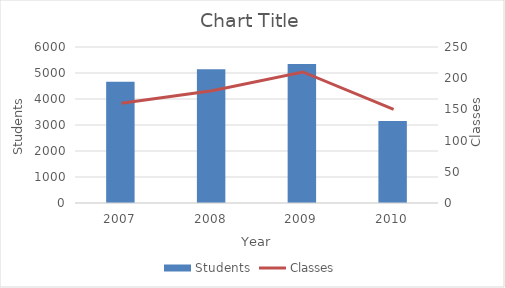
| Category | Students |
|---|---|
| 2007.0 | 4667 |
| 2008.0 | 5143 |
| 2009.0 | 5350 |
| 2010.0 | 3150 |